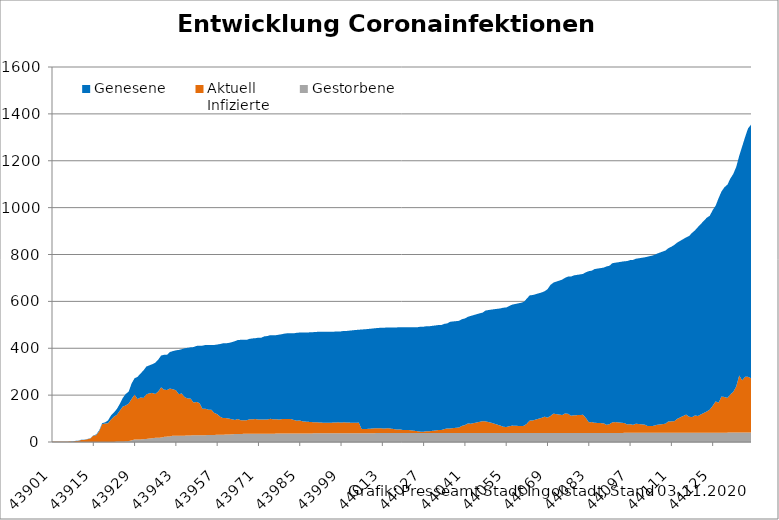
| Category | Gestorbene | Aktuell
Infizierte | Genesene |
|---|---|---|---|
| 43901.0 | 0 | 1 | 0 |
| 43902.0 | 0 | 1 | 0 |
| 43903.0 | 0 | 1 | 0 |
| 43904.0 | 0 | 1 | 0 |
| 43905.0 | 0 | 1 | 0 |
| 43906.0 | 0 | 1 | 0 |
| 43907.0 | 0 | 2 | 0 |
| 43908.0 | 0 | 1 | 1 |
| 43909.0 | 0 | 4 | 1 |
| 43910.0 | 0 | 5 | 1 |
| 43911.0 | 0 | 9 | 1 |
| 43912.0 | 0 | 9 | 1 |
| 43913.0 | 0 | 12 | 1 |
| 43914.0 | 0 | 15 | 1 |
| 43915.0 | 0 | 27 | 1 |
| 43916.0 | 0 | 29 | 3 |
| 43917.0 | 0 | 46 | 4 |
| 43918.0 | 0 | 76 | 4 |
| 43919.0 | 0 | 79 | 5 |
| 43920.0 | 0 | 80 | 12 |
| 43921.0 | 0 | 96 | 17 |
| 43922.0 | 0 | 108 | 18 |
| 43923.0 | 2 | 114 | 25 |
| 43924.0 | 2 | 132 | 29 |
| 43925.0 | 2 | 149 | 37 |
| 43926.0 | 3 | 153 | 49 |
| 43927.0 | 4 | 160 | 51 |
| 43928.0 | 7 | 177 | 66 |
| 43929.0 | 11 | 191 | 70 |
| 43930.0 | 11 | 172 | 95 |
| 43931.0 | 11 | 179 | 102 |
| 43932.0 | 12 | 176 | 117 |
| 43933.0 | 13 | 190 | 119 |
| 43934.0 | 15 | 193 | 119 |
| 43935.0 | 16 | 193 | 123 |
| 43936.0 | 18 | 187 | 133 |
| 43937.0 | 18 | 197 | 136 |
| 43938.0 | 19 | 214 | 136 |
| 43939.0 | 22 | 201 | 149 |
| 43940.0 | 23 | 199 | 150 |
| 43941.0 | 24 | 204 | 156 |
| 43942.0 | 27 | 198 | 163 |
| 43943.0 | 27 | 194 | 170 |
| 43944.0 | 27 | 177 | 189 |
| 43945.0 | 27 | 180 | 189 |
| 43946.0 | 27 | 164 | 209 |
| 43947.0 | 28 | 158 | 216 |
| 43948.0 | 28 | 157 | 219 |
| 43949.0 | 29 | 139 | 237 |
| 43950.0 | 29 | 142 | 239 |
| 43951.0 | 29 | 137 | 245 |
| 43952.0 | 29 | 113 | 269 |
| 43953.0 | 29 | 113 | 272 |
| 43954.0 | 30 | 108 | 276 |
| 43955.0 | 30 | 108 | 276 |
| 43956.0 | 30 | 94 | 290 |
| 43957.0 | 31 | 88 | 297 |
| 43958.0 | 31 | 77 | 310 |
| 43959.0 | 31 | 71 | 319 |
| 43960.0 | 32 | 70 | 319 |
| 43961.0 | 32 | 68 | 323 |
| 43962.0 | 33 | 64 | 329 |
| 43963.0 | 34 | 60 | 336 |
| 43964.0 | 34 | 64 | 337 |
| 43965.0 | 34 | 59 | 343 |
| 43966.0 | 35 | 58 | 343 |
| 43967.0 | 35 | 58 | 343 |
| 43968.0 | 35 | 62 | 343 |
| 43969.0 | 35 | 62 | 345 |
| 43970.0 | 35 | 63 | 345 |
| 43971.0 | 35 | 61 | 349 |
| 43972.0 | 35 | 61 | 349 |
| 43973.0 | 35 | 61 | 355 |
| 43974.0 | 35 | 61 | 356 |
| 43975.0 | 35 | 64 | 357 |
| 43976.0 | 35 | 62 | 359 |
| 43977.0 | 36 | 61 | 359 |
| 43978.0 | 36 | 60 | 362 |
| 43979.0 | 36 | 62 | 362 |
| 43980.0 | 36 | 62 | 365 |
| 43981.0 | 36 | 62 | 366 |
| 43982.0 | 36 | 62 | 366 |
| 43983.0 | 36 | 58 | 370 |
| 43984.0 | 36 | 55 | 375 |
| 43985.0 | 36 | 56 | 375 |
| 43986.0 | 36 | 52 | 379 |
| 43987.0 | 36 | 51 | 380 |
| 43990.0 | 37 | 47 | 385 |
| 43991.0 | 37 | 47 | 386 |
| 43992.0 | 37 | 46 | 387 |
| 43994.0 | 37 | 45 | 388 |
| 43997.0 | 37 | 46 | 388 |
| 43998.0 | 37 | 47 | 388 |
| 43999.0 | 37 | 46 | 389 |
| 44000.0 | 37 | 47 | 390 |
| 44001.0 | 37 | 46 | 391 |
| 44004.0 | 37 | 45 | 396 |
| 44005.0 | 37 | 46 | 396 |
| 44006.0 | 37 | 18 | 425 |
| 44007.0 | 37 | 18 | 426 |
| 44008.0 | 37 | 19 | 426 |
| 44011.0 | 38 | 21 | 427 |
| 44012.0 | 38 | 21 | 428 |
| 44013.0 | 38 | 20 | 430 |
| 44014.0 | 38 | 20 | 430 |
| 44015.0 | 38 | 21 | 430 |
| 44018.0 | 38 | 15 | 436 |
| 44019.0 | 38 | 16 | 436 |
| 44020.0 | 38 | 13 | 439 |
| 44021.0 | 38 | 13 | 439 |
| 44022.0 | 38 | 13 | 439 |
| 44025.0 | 38 | 8 | 444 |
| 44026.0 | 38 | 6 | 448 |
| 44027.0 | 38 | 6 | 448 |
| 44028.0 | 38 | 8 | 448 |
| 44029.0 | 38 | 8 | 448 |
| 44032.0 | 38 | 13 | 448 |
| 44033.0 | 38 | 13 | 448 |
| 44034.0 | 38 | 17 | 449 |
| 44035.0 | 38 | 20 | 448 |
| 44036.0 | 38 | 20 | 455 |
| 44039.0 | 38 | 24 | 455 |
| 44040.0 | 38 | 31 | 455 |
| 44041.0 | 38 | 34 | 455 |
| 44042.0 | 38 | 41 | 455 |
| 44043.0 | 38 | 40 | 460 |
| 44046.0 | 38 | 48 | 463 |
| 44047.0 | 38 | 51 | 463 |
| 44048.0 | 38 | 50 | 473 |
| 44049.0 | 38 | 47 | 478 |
| 44050.0 | 38 | 44 | 483 |
| 44053.0 | 38 | 32 | 500 |
| 44054.0 | 38 | 27 | 508 |
| 44055.0 | 38 | 26 | 510 |
| 44056.0 | 38 | 29 | 513 |
| 44057.0 | 38 | 32 | 516 |
| 44060.0 | 38 | 30 | 526 |
| 44061.0 | 38 | 31 | 529 |
| 44062.0 | 38 | 40 | 534 |
| 44063.0 | 38 | 54 | 534 |
| 44064.0 | 38 | 54 | 535 |
| 44067.0 | 38 | 65 | 535 |
| 44068.0 | 38 | 70 | 535 |
| 44069.0 | 38 | 66 | 548 |
| 44070.0 | 38 | 73 | 559 |
| 44071.0 | 38 | 83 | 559 |
| 44074.0 | 38 | 77 | 578 |
| 44075.0 | 38 | 84 | 579 |
| 44076.0 | 38 | 82 | 586 |
| 44077.0 | 38 | 74 | 594 |
| 44078.0 | 38 | 76 | 597 |
| 44081.0 | 38 | 78 | 601 |
| 44082.0 | 38 | 65 | 621 |
| 44083.0 | 38 | 46 | 645 |
| 44084.0 | 38 | 47 | 646 |
| 44085.0 | 38 | 44 | 656 |
| 44088.0 | 38 | 42 | 664 |
| 44089.0 | 38 | 35 | 676 |
| 44090.0 | 38 | 38 | 676 |
| 44091.0 | 38 | 46 | 679 |
| 44092.0 | 38 | 47 | 680 |
| 44095.0 | 39 | 42 | 690 |
| 44096.0 | 39 | 36 | 697 |
| 44097.0 | 39 | 37 | 700 |
| 44098.0 | 39 | 34 | 704 |
| 44099.0 | 39 | 39 | 704 |
| 44102.0 | 39 | 35 | 714 |
| 44103.0 | 39 | 29 | 723 |
| 44104.0 | 39 | 29 | 726 |
| 44105.0 | 39 | 30 | 728 |
| 44106.0 | 39 | 34 | 730 |
| 44109.0 | 39 | 39 | 739 |
| 44110.0 | 39 | 49 | 739 |
| 44111.0 | 39 | 49 | 745 |
| 44112.0 | 39 | 50 | 752 |
| 44113.0 | 39 | 60 | 752 |
| 44116.0 | 39 | 78 | 756 |
| 44117.0 | 39 | 69 | 771 |
| 44118.0 | 39 | 67 | 786 |
| 44119.0 | 39 | 74 | 790 |
| 44120.0 | 39 | 72 | 806 |
| 44123.0 | 39 | 91 | 827 |
| 44124.0 | 39 | 99 | 827 |
| 44125.0 | 39 | 115 | 835 |
| 44126.0 | 39 | 134 | 835 |
| 44127.0 | 39 | 129 | 872 |
| 44128.0 | 39 | 155 | 875 |
| 44129.0 | 40 | 152 | 895 |
| 44130.0 | 40 | 148 | 910 |
| 44131.0 | 41 | 162 | 921 |
| 44132.0 | 41 | 173 | 930 |
| 44133.0 | 41 | 196 | 937 |
| 44134.0 | 41 | 243 | 937 |
| 44135.0 | 41 | 222 | 998 |
| 44136.0 | 41 | 237 | 1023 |
| 44137.0 | 41 | 237 | 1060 |
| 44138.0 | 41 | 231 | 1082 |